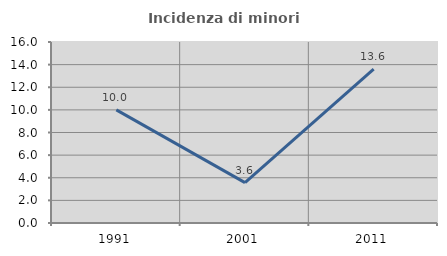
| Category | Incidenza di minori stranieri |
|---|---|
| 1991.0 | 10 |
| 2001.0 | 3.571 |
| 2011.0 | 13.6 |